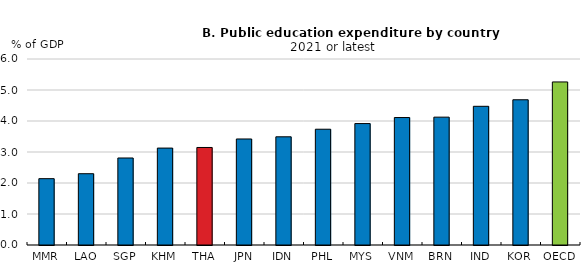
| Category | 2021 or latest |
|---|---|
| MMR | 2.14 |
| LAO | 2.3 |
| SGP | 2.806 |
| KHM | 3.126 |
| THA | 3.146 |
| JPN | 3.42 |
| IDN | 3.49 |
| PHL | 3.735 |
| MYS | 3.917 |
| VNM | 4.112 |
| BRN | 4.124 |
| IND | 4.474 |
| KOR | 4.685 |
| OECD | 5.26 |